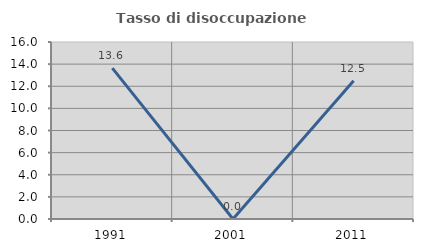
| Category | Tasso di disoccupazione giovanile  |
|---|---|
| 1991.0 | 13.636 |
| 2001.0 | 0 |
| 2011.0 | 12.5 |